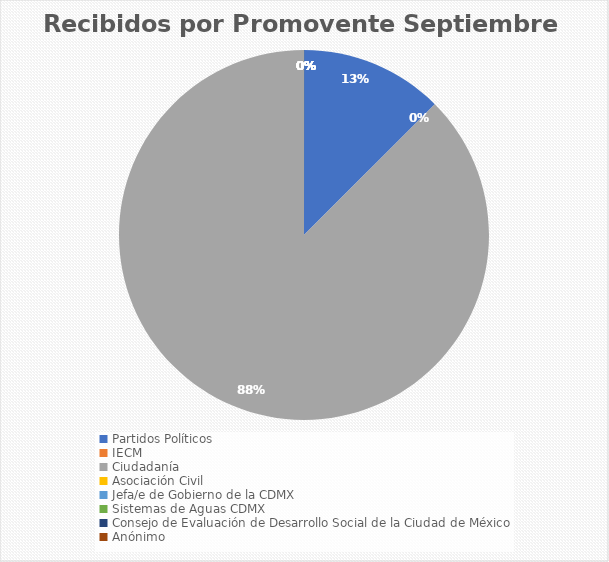
| Category | Recibidos por Promovente Septiembre |
|---|---|
| Partidos Políticos | 1 |
| IECM | 0 |
| Ciudadanía  | 7 |
| Asociación Civil | 0 |
| Jefa/e de Gobierno de la CDMX | 0 |
| Sistemas de Aguas CDMX | 0 |
| Consejo de Evaluación de Desarrollo Social de la Ciudad de México | 0 |
| Anónimo | 0 |